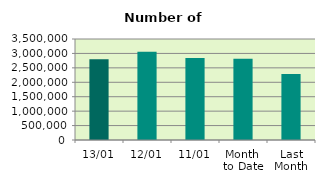
| Category | Series 0 |
|---|---|
| 13/01 | 2796468 |
| 12/01 | 3060694 |
| 11/01 | 2845856 |
| Month 
to Date | 2814462.667 |
| Last
Month | 2284008.087 |